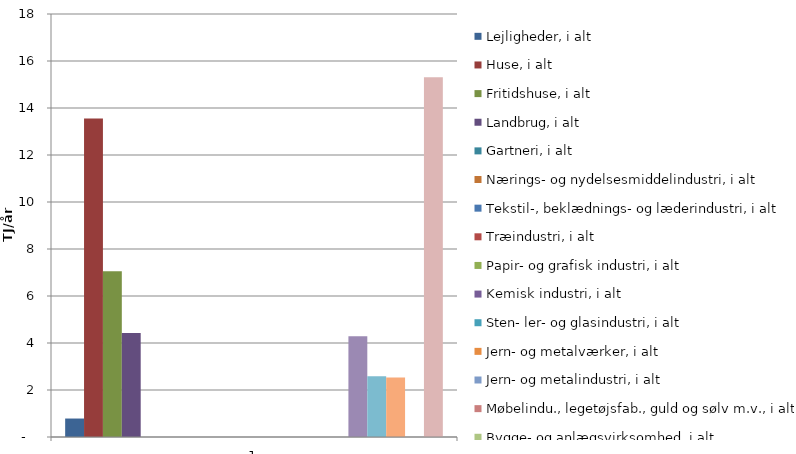
| Category | Lejligheder, i alt | Huse, i alt | Fritidshuse, i alt | Landbrug, i alt | Gartneri, i alt | Nærings- og nydelsesmiddelindustri, i alt | Tekstil-, beklædnings- og læderindustri, i alt | Træindustri, i alt | Papir- og grafisk industri, i alt | Kemisk industri, i alt | Sten- ler- og glasindustri, i alt | Jern- og metalværker, i alt | Jern- og metalindustri, i alt | Møbelindu., legetøjsfab., guld og sølv m.v., i alt | Bygge- og anlægsvirksomhed, i alt | Detail- og engroshandel, i alt | Service- og forlystelsesvirksomhed, i alt | Offentlige foretageneder, i alt | Gade- og vejbelysning, i alt | Anonymiseret og/eller ukendt |
|---|---|---|---|---|---|---|---|---|---|---|---|---|---|---|---|---|---|---|---|---|
| 0 | 0.786 | 13.558 | 7.05 | 4.429 | 0 | 0 | 0 | 0 | 0 | 0 | 0 | 0 | 0 | 0 | 0 | 4.291 | 2.588 | 2.527 | 0 | 15.311 |